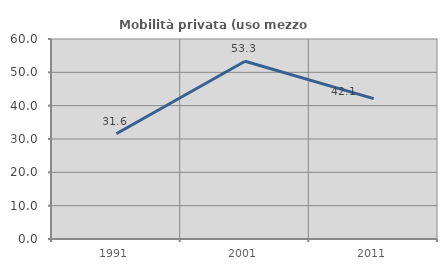
| Category | Mobilità privata (uso mezzo privato) |
|---|---|
| 1991.0 | 31.579 |
| 2001.0 | 53.333 |
| 2011.0 | 42.105 |